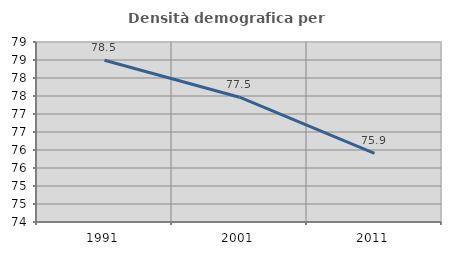
| Category | Densità demografica |
|---|---|
| 1991.0 | 78.495 |
| 2001.0 | 77.466 |
| 2011.0 | 75.905 |